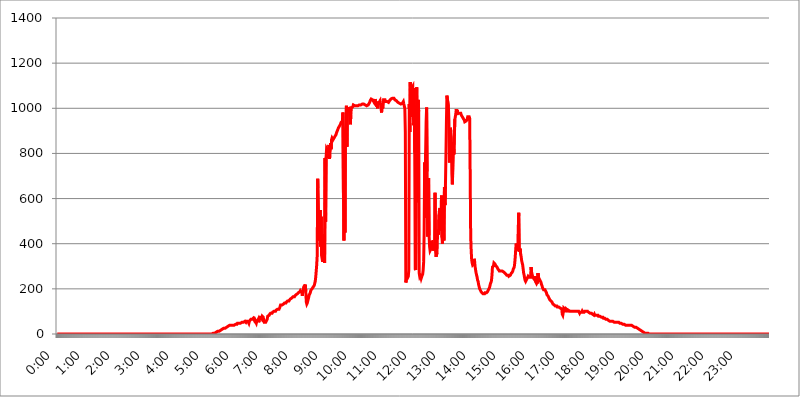
| Category | 2016.05.09. Intenzitás [W/m^2] |
|---|---|
| 0.0 | 0 |
| 0.0006944444444444445 | 0 |
| 0.001388888888888889 | 0 |
| 0.0020833333333333333 | 0 |
| 0.002777777777777778 | 0 |
| 0.003472222222222222 | 0 |
| 0.004166666666666667 | 0 |
| 0.004861111111111111 | 0 |
| 0.005555555555555556 | 0 |
| 0.0062499999999999995 | 0 |
| 0.006944444444444444 | 0 |
| 0.007638888888888889 | 0 |
| 0.008333333333333333 | 0 |
| 0.009027777777777779 | 0 |
| 0.009722222222222222 | 0 |
| 0.010416666666666666 | 0 |
| 0.011111111111111112 | 0 |
| 0.011805555555555555 | 0 |
| 0.012499999999999999 | 0 |
| 0.013194444444444444 | 0 |
| 0.013888888888888888 | 0 |
| 0.014583333333333332 | 0 |
| 0.015277777777777777 | 0 |
| 0.015972222222222224 | 0 |
| 0.016666666666666666 | 0 |
| 0.017361111111111112 | 0 |
| 0.018055555555555557 | 0 |
| 0.01875 | 0 |
| 0.019444444444444445 | 0 |
| 0.02013888888888889 | 0 |
| 0.020833333333333332 | 0 |
| 0.02152777777777778 | 0 |
| 0.022222222222222223 | 0 |
| 0.02291666666666667 | 0 |
| 0.02361111111111111 | 0 |
| 0.024305555555555556 | 0 |
| 0.024999999999999998 | 0 |
| 0.025694444444444447 | 0 |
| 0.02638888888888889 | 0 |
| 0.027083333333333334 | 0 |
| 0.027777777777777776 | 0 |
| 0.02847222222222222 | 0 |
| 0.029166666666666664 | 0 |
| 0.029861111111111113 | 0 |
| 0.030555555555555555 | 0 |
| 0.03125 | 0 |
| 0.03194444444444445 | 0 |
| 0.03263888888888889 | 0 |
| 0.03333333333333333 | 0 |
| 0.034027777777777775 | 0 |
| 0.034722222222222224 | 0 |
| 0.035416666666666666 | 0 |
| 0.036111111111111115 | 0 |
| 0.03680555555555556 | 0 |
| 0.0375 | 0 |
| 0.03819444444444444 | 0 |
| 0.03888888888888889 | 0 |
| 0.03958333333333333 | 0 |
| 0.04027777777777778 | 0 |
| 0.04097222222222222 | 0 |
| 0.041666666666666664 | 0 |
| 0.042361111111111106 | 0 |
| 0.04305555555555556 | 0 |
| 0.043750000000000004 | 0 |
| 0.044444444444444446 | 0 |
| 0.04513888888888889 | 0 |
| 0.04583333333333334 | 0 |
| 0.04652777777777778 | 0 |
| 0.04722222222222222 | 0 |
| 0.04791666666666666 | 0 |
| 0.04861111111111111 | 0 |
| 0.049305555555555554 | 0 |
| 0.049999999999999996 | 0 |
| 0.05069444444444445 | 0 |
| 0.051388888888888894 | 0 |
| 0.052083333333333336 | 0 |
| 0.05277777777777778 | 0 |
| 0.05347222222222222 | 0 |
| 0.05416666666666667 | 0 |
| 0.05486111111111111 | 0 |
| 0.05555555555555555 | 0 |
| 0.05625 | 0 |
| 0.05694444444444444 | 0 |
| 0.057638888888888885 | 0 |
| 0.05833333333333333 | 0 |
| 0.05902777777777778 | 0 |
| 0.059722222222222225 | 0 |
| 0.06041666666666667 | 0 |
| 0.061111111111111116 | 0 |
| 0.06180555555555556 | 0 |
| 0.0625 | 0 |
| 0.06319444444444444 | 0 |
| 0.06388888888888888 | 0 |
| 0.06458333333333334 | 0 |
| 0.06527777777777778 | 0 |
| 0.06597222222222222 | 0 |
| 0.06666666666666667 | 0 |
| 0.06736111111111111 | 0 |
| 0.06805555555555555 | 0 |
| 0.06874999999999999 | 0 |
| 0.06944444444444443 | 0 |
| 0.07013888888888889 | 0 |
| 0.07083333333333333 | 0 |
| 0.07152777777777779 | 0 |
| 0.07222222222222223 | 0 |
| 0.07291666666666667 | 0 |
| 0.07361111111111111 | 0 |
| 0.07430555555555556 | 0 |
| 0.075 | 0 |
| 0.07569444444444444 | 0 |
| 0.0763888888888889 | 0 |
| 0.07708333333333334 | 0 |
| 0.07777777777777778 | 0 |
| 0.07847222222222222 | 0 |
| 0.07916666666666666 | 0 |
| 0.0798611111111111 | 0 |
| 0.08055555555555556 | 0 |
| 0.08125 | 0 |
| 0.08194444444444444 | 0 |
| 0.08263888888888889 | 0 |
| 0.08333333333333333 | 0 |
| 0.08402777777777777 | 0 |
| 0.08472222222222221 | 0 |
| 0.08541666666666665 | 0 |
| 0.08611111111111112 | 0 |
| 0.08680555555555557 | 0 |
| 0.08750000000000001 | 0 |
| 0.08819444444444445 | 0 |
| 0.08888888888888889 | 0 |
| 0.08958333333333333 | 0 |
| 0.09027777777777778 | 0 |
| 0.09097222222222222 | 0 |
| 0.09166666666666667 | 0 |
| 0.09236111111111112 | 0 |
| 0.09305555555555556 | 0 |
| 0.09375 | 0 |
| 0.09444444444444444 | 0 |
| 0.09513888888888888 | 0 |
| 0.09583333333333333 | 0 |
| 0.09652777777777777 | 0 |
| 0.09722222222222222 | 0 |
| 0.09791666666666667 | 0 |
| 0.09861111111111111 | 0 |
| 0.09930555555555555 | 0 |
| 0.09999999999999999 | 0 |
| 0.10069444444444443 | 0 |
| 0.1013888888888889 | 0 |
| 0.10208333333333335 | 0 |
| 0.10277777777777779 | 0 |
| 0.10347222222222223 | 0 |
| 0.10416666666666667 | 0 |
| 0.10486111111111111 | 0 |
| 0.10555555555555556 | 0 |
| 0.10625 | 0 |
| 0.10694444444444444 | 0 |
| 0.1076388888888889 | 0 |
| 0.10833333333333334 | 0 |
| 0.10902777777777778 | 0 |
| 0.10972222222222222 | 0 |
| 0.1111111111111111 | 0 |
| 0.11180555555555556 | 0 |
| 0.11180555555555556 | 0 |
| 0.1125 | 0 |
| 0.11319444444444444 | 0 |
| 0.11388888888888889 | 0 |
| 0.11458333333333333 | 0 |
| 0.11527777777777777 | 0 |
| 0.11597222222222221 | 0 |
| 0.11666666666666665 | 0 |
| 0.1173611111111111 | 0 |
| 0.11805555555555557 | 0 |
| 0.11944444444444445 | 0 |
| 0.12013888888888889 | 0 |
| 0.12083333333333333 | 0 |
| 0.12152777777777778 | 0 |
| 0.12222222222222223 | 0 |
| 0.12291666666666667 | 0 |
| 0.12291666666666667 | 0 |
| 0.12361111111111112 | 0 |
| 0.12430555555555556 | 0 |
| 0.125 | 0 |
| 0.12569444444444444 | 0 |
| 0.12638888888888888 | 0 |
| 0.12708333333333333 | 0 |
| 0.16875 | 0 |
| 0.12847222222222224 | 0 |
| 0.12916666666666668 | 0 |
| 0.12986111111111112 | 0 |
| 0.13055555555555556 | 0 |
| 0.13125 | 0 |
| 0.13194444444444445 | 0 |
| 0.1326388888888889 | 0 |
| 0.13333333333333333 | 0 |
| 0.13402777777777777 | 0 |
| 0.13402777777777777 | 0 |
| 0.13472222222222222 | 0 |
| 0.13541666666666666 | 0 |
| 0.1361111111111111 | 0 |
| 0.13749999999999998 | 0 |
| 0.13819444444444443 | 0 |
| 0.1388888888888889 | 0 |
| 0.13958333333333334 | 0 |
| 0.14027777777777778 | 0 |
| 0.14097222222222222 | 0 |
| 0.14166666666666666 | 0 |
| 0.1423611111111111 | 0 |
| 0.14305555555555557 | 0 |
| 0.14375000000000002 | 0 |
| 0.14444444444444446 | 0 |
| 0.1451388888888889 | 0 |
| 0.1451388888888889 | 0 |
| 0.14652777777777778 | 0 |
| 0.14722222222222223 | 0 |
| 0.14791666666666667 | 0 |
| 0.1486111111111111 | 0 |
| 0.14930555555555555 | 0 |
| 0.15 | 0 |
| 0.15069444444444444 | 0 |
| 0.15138888888888888 | 0 |
| 0.15208333333333332 | 0 |
| 0.15277777777777776 | 0 |
| 0.15347222222222223 | 0 |
| 0.15416666666666667 | 0 |
| 0.15486111111111112 | 0 |
| 0.15555555555555556 | 0 |
| 0.15625 | 0 |
| 0.15694444444444444 | 0 |
| 0.15763888888888888 | 0 |
| 0.15833333333333333 | 0 |
| 0.15902777777777777 | 0 |
| 0.15972222222222224 | 0 |
| 0.16041666666666668 | 0 |
| 0.16111111111111112 | 0 |
| 0.16180555555555556 | 0 |
| 0.1625 | 0 |
| 0.16319444444444445 | 0 |
| 0.1638888888888889 | 0 |
| 0.16458333333333333 | 0 |
| 0.16527777777777777 | 0 |
| 0.16597222222222222 | 0 |
| 0.16666666666666666 | 0 |
| 0.1673611111111111 | 0 |
| 0.16805555555555554 | 0 |
| 0.16874999999999998 | 0 |
| 0.16944444444444443 | 0 |
| 0.17013888888888887 | 0 |
| 0.1708333333333333 | 0 |
| 0.17152777777777775 | 0 |
| 0.17222222222222225 | 0 |
| 0.1729166666666667 | 0 |
| 0.17361111111111113 | 0 |
| 0.17430555555555557 | 0 |
| 0.17500000000000002 | 0 |
| 0.17569444444444446 | 0 |
| 0.1763888888888889 | 0 |
| 0.17708333333333334 | 0 |
| 0.17777777777777778 | 0 |
| 0.17847222222222223 | 0 |
| 0.17916666666666667 | 0 |
| 0.1798611111111111 | 0 |
| 0.18055555555555555 | 0 |
| 0.18125 | 0 |
| 0.18194444444444444 | 0 |
| 0.1826388888888889 | 0 |
| 0.18333333333333335 | 0 |
| 0.1840277777777778 | 0 |
| 0.18472222222222223 | 0 |
| 0.18541666666666667 | 0 |
| 0.18611111111111112 | 0 |
| 0.18680555555555556 | 0 |
| 0.1875 | 0 |
| 0.18819444444444444 | 0 |
| 0.18888888888888888 | 0 |
| 0.18958333333333333 | 0 |
| 0.19027777777777777 | 0 |
| 0.1909722222222222 | 0 |
| 0.19166666666666665 | 0 |
| 0.19236111111111112 | 0 |
| 0.19305555555555554 | 0 |
| 0.19375 | 0 |
| 0.19444444444444445 | 0 |
| 0.1951388888888889 | 0 |
| 0.19583333333333333 | 0 |
| 0.19652777777777777 | 0 |
| 0.19722222222222222 | 0 |
| 0.19791666666666666 | 0 |
| 0.1986111111111111 | 0 |
| 0.19930555555555554 | 0 |
| 0.19999999999999998 | 0 |
| 0.20069444444444443 | 0 |
| 0.20138888888888887 | 0 |
| 0.2020833333333333 | 0 |
| 0.2027777777777778 | 0 |
| 0.2034722222222222 | 0 |
| 0.2041666666666667 | 0 |
| 0.20486111111111113 | 0 |
| 0.20555555555555557 | 0 |
| 0.20625000000000002 | 0 |
| 0.20694444444444446 | 0 |
| 0.2076388888888889 | 0 |
| 0.20833333333333334 | 0 |
| 0.20902777777777778 | 0 |
| 0.20972222222222223 | 0 |
| 0.21041666666666667 | 0 |
| 0.2111111111111111 | 0 |
| 0.21180555555555555 | 0 |
| 0.2125 | 0 |
| 0.21319444444444444 | 0 |
| 0.2138888888888889 | 0 |
| 0.21458333333333335 | 0 |
| 0.2152777777777778 | 0 |
| 0.21597222222222223 | 0 |
| 0.21666666666666667 | 0 |
| 0.21736111111111112 | 3.525 |
| 0.21805555555555556 | 3.525 |
| 0.21875 | 3.525 |
| 0.21944444444444444 | 3.525 |
| 0.22013888888888888 | 3.525 |
| 0.22083333333333333 | 3.525 |
| 0.22152777777777777 | 7.887 |
| 0.2222222222222222 | 7.887 |
| 0.22291666666666665 | 7.887 |
| 0.2236111111111111 | 7.887 |
| 0.22430555555555556 | 7.887 |
| 0.225 | 12.257 |
| 0.22569444444444445 | 12.257 |
| 0.2263888888888889 | 12.257 |
| 0.22708333333333333 | 12.257 |
| 0.22777777777777777 | 16.636 |
| 0.22847222222222222 | 16.636 |
| 0.22916666666666666 | 16.636 |
| 0.2298611111111111 | 21.024 |
| 0.23055555555555554 | 21.024 |
| 0.23124999999999998 | 21.024 |
| 0.23194444444444443 | 21.024 |
| 0.23263888888888887 | 21.024 |
| 0.2333333333333333 | 25.419 |
| 0.2340277777777778 | 25.419 |
| 0.2347222222222222 | 25.419 |
| 0.2354166666666667 | 25.419 |
| 0.23611111111111113 | 29.823 |
| 0.23680555555555557 | 29.823 |
| 0.23750000000000002 | 29.823 |
| 0.23819444444444446 | 29.823 |
| 0.2388888888888889 | 34.234 |
| 0.23958333333333334 | 34.234 |
| 0.24027777777777778 | 34.234 |
| 0.24097222222222223 | 34.234 |
| 0.24166666666666667 | 38.653 |
| 0.2423611111111111 | 38.653 |
| 0.24305555555555555 | 38.653 |
| 0.24375 | 38.653 |
| 0.24444444444444446 | 38.653 |
| 0.24513888888888888 | 38.653 |
| 0.24583333333333335 | 38.653 |
| 0.2465277777777778 | 38.653 |
| 0.24722222222222223 | 38.653 |
| 0.24791666666666667 | 38.653 |
| 0.24861111111111112 | 38.653 |
| 0.24930555555555556 | 43.079 |
| 0.25 | 43.079 |
| 0.25069444444444444 | 43.079 |
| 0.2513888888888889 | 43.079 |
| 0.2520833333333333 | 43.079 |
| 0.25277777777777777 | 47.511 |
| 0.2534722222222222 | 47.511 |
| 0.25416666666666665 | 47.511 |
| 0.2548611111111111 | 47.511 |
| 0.2555555555555556 | 47.511 |
| 0.25625000000000003 | 47.511 |
| 0.2569444444444445 | 47.511 |
| 0.2576388888888889 | 47.511 |
| 0.25833333333333336 | 47.511 |
| 0.2590277777777778 | 51.951 |
| 0.25972222222222224 | 51.951 |
| 0.2604166666666667 | 51.951 |
| 0.2611111111111111 | 51.951 |
| 0.26180555555555557 | 51.951 |
| 0.2625 | 51.951 |
| 0.26319444444444445 | 56.398 |
| 0.2638888888888889 | 56.398 |
| 0.26458333333333334 | 51.951 |
| 0.2652777777777778 | 56.398 |
| 0.2659722222222222 | 56.398 |
| 0.26666666666666666 | 56.398 |
| 0.2673611111111111 | 56.398 |
| 0.26805555555555555 | 51.951 |
| 0.26875 | 47.511 |
| 0.26944444444444443 | 56.398 |
| 0.2701388888888889 | 56.398 |
| 0.2708333333333333 | 56.398 |
| 0.27152777777777776 | 65.31 |
| 0.2722222222222222 | 65.31 |
| 0.27291666666666664 | 65.31 |
| 0.2736111111111111 | 65.31 |
| 0.2743055555555555 | 65.31 |
| 0.27499999999999997 | 69.775 |
| 0.27569444444444446 | 65.31 |
| 0.27638888888888885 | 60.85 |
| 0.27708333333333335 | 65.31 |
| 0.2777777777777778 | 60.85 |
| 0.27847222222222223 | 51.951 |
| 0.2791666666666667 | 47.511 |
| 0.2798611111111111 | 56.398 |
| 0.28055555555555556 | 56.398 |
| 0.28125 | 60.85 |
| 0.28194444444444444 | 65.31 |
| 0.2826388888888889 | 51.951 |
| 0.2833333333333333 | 60.85 |
| 0.28402777777777777 | 74.246 |
| 0.2847222222222222 | 74.246 |
| 0.28541666666666665 | 74.246 |
| 0.28611111111111115 | 74.246 |
| 0.28680555555555554 | 69.775 |
| 0.28750000000000003 | 78.722 |
| 0.2881944444444445 | 78.722 |
| 0.2888888888888889 | 74.246 |
| 0.28958333333333336 | 60.85 |
| 0.2902777777777778 | 51.951 |
| 0.29097222222222224 | 51.951 |
| 0.2916666666666667 | 51.951 |
| 0.2923611111111111 | 51.951 |
| 0.29305555555555557 | 56.398 |
| 0.29375 | 56.398 |
| 0.29444444444444445 | 65.31 |
| 0.2951388888888889 | 78.722 |
| 0.29583333333333334 | 78.722 |
| 0.2965277777777778 | 78.722 |
| 0.2972222222222222 | 83.205 |
| 0.29791666666666666 | 87.692 |
| 0.2986111111111111 | 87.692 |
| 0.29930555555555555 | 92.184 |
| 0.3 | 92.184 |
| 0.30069444444444443 | 92.184 |
| 0.3013888888888889 | 92.184 |
| 0.3020833333333333 | 96.682 |
| 0.30277777777777776 | 96.682 |
| 0.3034722222222222 | 96.682 |
| 0.30416666666666664 | 101.184 |
| 0.3048611111111111 | 101.184 |
| 0.3055555555555555 | 101.184 |
| 0.30624999999999997 | 101.184 |
| 0.3069444444444444 | 105.69 |
| 0.3076388888888889 | 105.69 |
| 0.30833333333333335 | 105.69 |
| 0.3090277777777778 | 110.201 |
| 0.30972222222222223 | 110.201 |
| 0.3104166666666667 | 110.201 |
| 0.3111111111111111 | 110.201 |
| 0.31180555555555556 | 114.716 |
| 0.3125 | 114.716 |
| 0.31319444444444444 | 128.284 |
| 0.3138888888888889 | 128.284 |
| 0.3145833333333333 | 128.284 |
| 0.31527777777777777 | 128.284 |
| 0.3159722222222222 | 128.284 |
| 0.31666666666666665 | 128.284 |
| 0.31736111111111115 | 132.814 |
| 0.31805555555555554 | 132.814 |
| 0.31875000000000003 | 137.347 |
| 0.3194444444444445 | 137.347 |
| 0.3201388888888889 | 137.347 |
| 0.32083333333333336 | 137.347 |
| 0.3215277777777778 | 141.884 |
| 0.32222222222222224 | 141.884 |
| 0.3229166666666667 | 146.423 |
| 0.3236111111111111 | 146.423 |
| 0.32430555555555557 | 146.423 |
| 0.325 | 146.423 |
| 0.32569444444444445 | 150.964 |
| 0.3263888888888889 | 150.964 |
| 0.32708333333333334 | 155.509 |
| 0.3277777777777778 | 155.509 |
| 0.3284722222222222 | 155.509 |
| 0.32916666666666666 | 160.056 |
| 0.3298611111111111 | 160.056 |
| 0.33055555555555555 | 164.605 |
| 0.33125 | 164.605 |
| 0.33194444444444443 | 164.605 |
| 0.3326388888888889 | 164.605 |
| 0.3333333333333333 | 169.156 |
| 0.3340277777777778 | 169.156 |
| 0.3347222222222222 | 173.709 |
| 0.3354166666666667 | 173.709 |
| 0.3361111111111111 | 173.709 |
| 0.3368055555555556 | 178.264 |
| 0.33749999999999997 | 178.264 |
| 0.33819444444444446 | 182.82 |
| 0.33888888888888885 | 182.82 |
| 0.33958333333333335 | 182.82 |
| 0.34027777777777773 | 187.378 |
| 0.34097222222222223 | 191.937 |
| 0.3416666666666666 | 191.937 |
| 0.3423611111111111 | 191.937 |
| 0.3430555555555555 | 182.82 |
| 0.34375 | 169.156 |
| 0.3444444444444445 | 187.378 |
| 0.3451388888888889 | 201.058 |
| 0.3458333333333334 | 210.182 |
| 0.34652777777777777 | 210.182 |
| 0.34722222222222227 | 214.746 |
| 0.34791666666666665 | 219.309 |
| 0.34861111111111115 | 187.378 |
| 0.34930555555555554 | 141.884 |
| 0.35000000000000003 | 132.814 |
| 0.3506944444444444 | 137.347 |
| 0.3513888888888889 | 146.423 |
| 0.3520833333333333 | 155.509 |
| 0.3527777777777778 | 164.605 |
| 0.3534722222222222 | 173.709 |
| 0.3541666666666667 | 178.264 |
| 0.3548611111111111 | 182.82 |
| 0.35555555555555557 | 191.937 |
| 0.35625 | 196.497 |
| 0.35694444444444445 | 196.497 |
| 0.3576388888888889 | 201.058 |
| 0.35833333333333334 | 205.62 |
| 0.3590277777777778 | 205.62 |
| 0.3597222222222222 | 205.62 |
| 0.36041666666666666 | 214.746 |
| 0.3611111111111111 | 223.873 |
| 0.36180555555555555 | 233 |
| 0.3625 | 251.251 |
| 0.36319444444444443 | 278.603 |
| 0.3638888888888889 | 305.898 |
| 0.3645833333333333 | 346.682 |
| 0.3652777777777778 | 687.544 |
| 0.3659722222222222 | 691.608 |
| 0.3666666666666667 | 458.38 |
| 0.3673611111111111 | 414.035 |
| 0.3680555555555556 | 440.702 |
| 0.36874999999999997 | 549.704 |
| 0.36944444444444446 | 387.202 |
| 0.37013888888888885 | 519.555 |
| 0.37083333333333335 | 346.682 |
| 0.37152777777777773 | 333.113 |
| 0.37222222222222223 | 319.517 |
| 0.3729166666666666 | 373.729 |
| 0.3736111111111111 | 360.221 |
| 0.3743055555555555 | 440.702 |
| 0.375 | 314.98 |
| 0.3756944444444445 | 779.42 |
| 0.3763888888888889 | 497.836 |
| 0.3770833333333334 | 783.342 |
| 0.37777777777777777 | 822.26 |
| 0.37847222222222227 | 822.26 |
| 0.37916666666666665 | 814.519 |
| 0.37986111111111115 | 822.26 |
| 0.38055555555555554 | 779.42 |
| 0.38125000000000003 | 837.682 |
| 0.3819444444444444 | 775.492 |
| 0.3826388888888889 | 829.981 |
| 0.3833333333333333 | 845.365 |
| 0.3840277777777778 | 818.392 |
| 0.3847222222222222 | 860.676 |
| 0.3854166666666667 | 868.305 |
| 0.3861111111111111 | 864.493 |
| 0.38680555555555557 | 860.676 |
| 0.3875 | 864.493 |
| 0.38819444444444445 | 868.305 |
| 0.3888888888888889 | 872.114 |
| 0.38958333333333334 | 875.918 |
| 0.3902777777777778 | 879.719 |
| 0.3909722222222222 | 883.516 |
| 0.39166666666666666 | 891.099 |
| 0.3923611111111111 | 894.885 |
| 0.39305555555555555 | 902.447 |
| 0.39375 | 902.447 |
| 0.39444444444444443 | 913.766 |
| 0.3951388888888889 | 917.534 |
| 0.3958333333333333 | 921.298 |
| 0.3965277777777778 | 925.06 |
| 0.3972222222222222 | 928.819 |
| 0.3979166666666667 | 936.33 |
| 0.3986111111111111 | 940.082 |
| 0.3993055555555556 | 940.082 |
| 0.39999999999999997 | 943.832 |
| 0.40069444444444446 | 981.244 |
| 0.40138888888888885 | 625.784 |
| 0.40208333333333335 | 414.035 |
| 0.40277777777777773 | 883.516 |
| 0.40347222222222223 | 449.551 |
| 0.4041666666666666 | 891.099 |
| 0.4048611111111111 | 943.832 |
| 0.4055555555555555 | 1011.118 |
| 0.40625 | 829.981 |
| 0.4069444444444445 | 1003.65 |
| 0.4076388888888889 | 996.182 |
| 0.4083333333333334 | 996.182 |
| 0.40902777777777777 | 996.182 |
| 0.40972222222222227 | 999.916 |
| 0.41041666666666665 | 1003.65 |
| 0.41111111111111115 | 928.819 |
| 0.41180555555555554 | 973.772 |
| 0.41250000000000003 | 999.916 |
| 0.4131944444444444 | 999.916 |
| 0.4138888888888889 | 1003.65 |
| 0.4145833333333333 | 1007.383 |
| 0.4152777777777778 | 1014.852 |
| 0.4159722222222222 | 1014.852 |
| 0.4166666666666667 | 1011.118 |
| 0.4173611111111111 | 1011.118 |
| 0.41805555555555557 | 1011.118 |
| 0.41875 | 1007.383 |
| 0.41944444444444445 | 1011.118 |
| 0.4201388888888889 | 1007.383 |
| 0.42083333333333334 | 1014.852 |
| 0.4215277777777778 | 1011.118 |
| 0.4222222222222222 | 1011.118 |
| 0.42291666666666666 | 1011.118 |
| 0.4236111111111111 | 1014.852 |
| 0.42430555555555555 | 1014.852 |
| 0.425 | 1014.852 |
| 0.42569444444444443 | 1014.852 |
| 0.4263888888888889 | 1011.118 |
| 0.4270833333333333 | 1014.852 |
| 0.4277777777777778 | 1018.587 |
| 0.4284722222222222 | 1018.587 |
| 0.4291666666666667 | 1018.587 |
| 0.4298611111111111 | 1018.587 |
| 0.4305555555555556 | 1014.852 |
| 0.43124999999999997 | 1014.852 |
| 0.43194444444444446 | 1014.852 |
| 0.43263888888888885 | 1011.118 |
| 0.43333333333333335 | 1011.118 |
| 0.43402777777777773 | 1011.118 |
| 0.43472222222222223 | 1014.852 |
| 0.4354166666666666 | 1014.852 |
| 0.4361111111111111 | 1014.852 |
| 0.4368055555555555 | 1014.852 |
| 0.4375 | 1018.587 |
| 0.4381944444444445 | 1026.06 |
| 0.4388888888888889 | 1033.537 |
| 0.4395833333333334 | 1037.277 |
| 0.44027777777777777 | 1041.019 |
| 0.44097222222222227 | 1044.762 |
| 0.44166666666666665 | 1037.277 |
| 0.44236111111111115 | 1037.277 |
| 0.44305555555555554 | 1041.019 |
| 0.44375000000000003 | 1037.277 |
| 0.4444444444444444 | 1026.06 |
| 0.4451388888888889 | 1026.06 |
| 0.4458333333333333 | 1041.019 |
| 0.4465277777777778 | 1026.06 |
| 0.4472222222222222 | 1018.587 |
| 0.4479166666666667 | 1007.383 |
| 0.4486111111111111 | 1014.852 |
| 0.44930555555555557 | 999.916 |
| 0.45 | 1029.798 |
| 0.45069444444444445 | 1018.587 |
| 0.4513888888888889 | 1026.06 |
| 0.45208333333333334 | 1029.798 |
| 0.4527777777777778 | 1033.537 |
| 0.4534722222222222 | 1033.537 |
| 0.45416666666666666 | 1029.798 |
| 0.4548611111111111 | 981.244 |
| 0.45555555555555555 | 1011.118 |
| 0.45625 | 999.916 |
| 0.45694444444444443 | 1007.383 |
| 0.4576388888888889 | 1037.277 |
| 0.4583333333333333 | 1037.277 |
| 0.4590277777777778 | 1033.537 |
| 0.4597222222222222 | 1037.277 |
| 0.4604166666666667 | 1029.798 |
| 0.4611111111111111 | 1029.798 |
| 0.4618055555555556 | 1029.798 |
| 0.46249999999999997 | 1029.798 |
| 0.46319444444444446 | 1026.06 |
| 0.46388888888888885 | 1026.06 |
| 0.46458333333333335 | 1026.06 |
| 0.46527777777777773 | 1026.06 |
| 0.46597222222222223 | 1033.537 |
| 0.4666666666666666 | 1037.277 |
| 0.4673611111111111 | 1037.277 |
| 0.4680555555555555 | 1041.019 |
| 0.46875 | 1041.019 |
| 0.4694444444444445 | 1044.762 |
| 0.4701388888888889 | 1044.762 |
| 0.4708333333333334 | 1044.762 |
| 0.47152777777777777 | 1044.762 |
| 0.47222222222222227 | 1044.762 |
| 0.47291666666666665 | 1041.019 |
| 0.47361111111111115 | 1037.277 |
| 0.47430555555555554 | 1037.277 |
| 0.47500000000000003 | 1037.277 |
| 0.4756944444444444 | 1033.537 |
| 0.4763888888888889 | 1033.537 |
| 0.4770833333333333 | 1029.798 |
| 0.4777777777777778 | 1026.06 |
| 0.4784722222222222 | 1026.06 |
| 0.4791666666666667 | 1022.323 |
| 0.4798611111111111 | 1022.323 |
| 0.48055555555555557 | 1018.587 |
| 0.48125 | 1018.587 |
| 0.48194444444444445 | 1018.587 |
| 0.4826388888888889 | 1018.587 |
| 0.48333333333333334 | 1022.323 |
| 0.4840277777777778 | 1022.323 |
| 0.4847222222222222 | 1026.06 |
| 0.48541666666666666 | 1029.798 |
| 0.4861111111111111 | 1018.587 |
| 0.48680555555555555 | 1022.323 |
| 0.4875 | 999.916 |
| 0.48819444444444443 | 894.885 |
| 0.4888888888888889 | 228.436 |
| 0.4895833333333333 | 237.564 |
| 0.4902777777777778 | 264.932 |
| 0.4909722222222222 | 255.813 |
| 0.4916666666666667 | 251.251 |
| 0.4923611111111111 | 255.813 |
| 0.4930555555555556 | 283.156 |
| 0.49374999999999997 | 1018.587 |
| 0.49444444444444446 | 894.885 |
| 0.49513888888888885 | 1116.426 |
| 0.49583333333333335 | 962.555 |
| 0.49652777777777773 | 1063.51 |
| 0.49722222222222223 | 1089.873 |
| 0.4979166666666666 | 1093.653 |
| 0.4986111111111111 | 1097.437 |
| 0.4993055555555555 | 1101.226 |
| 0.5 | 925.06 |
| 0.5006944444444444 | 1089.873 |
| 0.5013888888888889 | 802.868 |
| 0.5020833333333333 | 287.709 |
| 0.5027777777777778 | 283.156 |
| 0.5034722222222222 | 902.447 |
| 0.5041666666666667 | 1093.653 |
| 0.5048611111111111 | 1089.873 |
| 0.5055555555555555 | 583.779 |
| 0.50625 | 1037.277 |
| 0.5069444444444444 | 984.98 |
| 0.5076388888888889 | 269.49 |
| 0.5083333333333333 | 255.813 |
| 0.5090277777777777 | 260.373 |
| 0.5097222222222222 | 255.813 |
| 0.5104166666666666 | 246.689 |
| 0.5111111111111112 | 246.689 |
| 0.5118055555555555 | 260.373 |
| 0.5125000000000001 | 264.932 |
| 0.5131944444444444 | 283.156 |
| 0.513888888888889 | 319.517 |
| 0.5145833333333333 | 449.551 |
| 0.5152777777777778 | 759.723 |
| 0.5159722222222222 | 515.223 |
| 0.5166666666666667 | 802.868 |
| 0.517361111111111 | 940.082 |
| 0.5180555555555556 | 1003.65 |
| 0.5187499999999999 | 719.877 |
| 0.5194444444444445 | 431.833 |
| 0.5201388888888888 | 480.356 |
| 0.5208333333333334 | 691.608 |
| 0.5215277777777778 | 436.27 |
| 0.5222222222222223 | 387.202 |
| 0.5229166666666667 | 369.23 |
| 0.5236111111111111 | 369.23 |
| 0.5243055555555556 | 378.224 |
| 0.525 | 414.035 |
| 0.5256944444444445 | 409.574 |
| 0.5263888888888889 | 387.202 |
| 0.5270833333333333 | 369.23 |
| 0.5277777777777778 | 369.23 |
| 0.5284722222222222 | 369.23 |
| 0.5291666666666667 | 396.164 |
| 0.5298611111111111 | 625.784 |
| 0.5305555555555556 | 369.23 |
| 0.53125 | 342.162 |
| 0.5319444444444444 | 342.162 |
| 0.5326388888888889 | 360.221 |
| 0.5333333333333333 | 440.702 |
| 0.5340277777777778 | 458.38 |
| 0.5347222222222222 | 440.702 |
| 0.5354166666666667 | 528.2 |
| 0.5361111111111111 | 549.704 |
| 0.5368055555555555 | 558.261 |
| 0.5375 | 458.38 |
| 0.5381944444444444 | 506.542 |
| 0.5388888888888889 | 613.252 |
| 0.5395833333333333 | 427.39 |
| 0.5402777777777777 | 400.638 |
| 0.5409722222222222 | 609.062 |
| 0.5416666666666666 | 497.836 |
| 0.5423611111111112 | 414.035 |
| 0.5430555555555555 | 650.667 |
| 0.5437500000000001 | 571.049 |
| 0.5444444444444444 | 654.791 |
| 0.545138888888889 | 791.169 |
| 0.5458333333333333 | 940.082 |
| 0.5465277777777778 | 1056.004 |
| 0.5472222222222222 | 1059.756 |
| 0.5479166666666667 | 1052.255 |
| 0.548611111111111 | 1007.383 |
| 0.5493055555555556 | 947.58 |
| 0.5499999999999999 | 759.723 |
| 0.5506944444444445 | 818.392 |
| 0.5513888888888888 | 913.766 |
| 0.5520833333333334 | 894.885 |
| 0.5527777777777778 | 864.493 |
| 0.5534722222222223 | 707.8 |
| 0.5541666666666667 | 663.019 |
| 0.5548611111111111 | 663.019 |
| 0.5555555555555556 | 849.199 |
| 0.55625 | 795.074 |
| 0.5569444444444445 | 795.074 |
| 0.5576388888888889 | 951.327 |
| 0.5583333333333333 | 962.555 |
| 0.5590277777777778 | 977.508 |
| 0.5597222222222222 | 996.182 |
| 0.5604166666666667 | 970.034 |
| 0.5611111111111111 | 992.448 |
| 0.5618055555555556 | 977.508 |
| 0.5625 | 973.772 |
| 0.5631944444444444 | 977.508 |
| 0.5638888888888889 | 977.508 |
| 0.5645833333333333 | 977.508 |
| 0.5652777777777778 | 977.508 |
| 0.5659722222222222 | 977.508 |
| 0.5666666666666667 | 970.034 |
| 0.5673611111111111 | 966.295 |
| 0.5680555555555555 | 962.555 |
| 0.56875 | 962.555 |
| 0.5694444444444444 | 955.071 |
| 0.5701388888888889 | 955.071 |
| 0.5708333333333333 | 947.58 |
| 0.5715277777777777 | 940.082 |
| 0.5722222222222222 | 936.33 |
| 0.5729166666666666 | 943.832 |
| 0.5736111111111112 | 943.832 |
| 0.5743055555555555 | 943.832 |
| 0.5750000000000001 | 951.327 |
| 0.5756944444444444 | 962.555 |
| 0.576388888888889 | 966.295 |
| 0.5770833333333333 | 962.555 |
| 0.5777777777777778 | 962.555 |
| 0.5784722222222222 | 955.071 |
| 0.5791666666666667 | 951.327 |
| 0.579861111111111 | 436.27 |
| 0.5805555555555556 | 369.23 |
| 0.5812499999999999 | 328.584 |
| 0.5819444444444445 | 314.98 |
| 0.5826388888888888 | 305.898 |
| 0.5833333333333334 | 305.898 |
| 0.5840277777777778 | 310.44 |
| 0.5847222222222223 | 333.113 |
| 0.5854166666666667 | 319.517 |
| 0.5861111111111111 | 296.808 |
| 0.5868055555555556 | 283.156 |
| 0.5875 | 269.49 |
| 0.5881944444444445 | 260.373 |
| 0.5888888888888889 | 251.251 |
| 0.5895833333333333 | 237.564 |
| 0.5902777777777778 | 233 |
| 0.5909722222222222 | 219.309 |
| 0.5916666666666667 | 210.182 |
| 0.5923611111111111 | 201.058 |
| 0.5930555555555556 | 196.497 |
| 0.59375 | 191.937 |
| 0.5944444444444444 | 187.378 |
| 0.5951388888888889 | 187.378 |
| 0.5958333333333333 | 182.82 |
| 0.5965277777777778 | 182.82 |
| 0.5972222222222222 | 178.264 |
| 0.5979166666666667 | 178.264 |
| 0.5986111111111111 | 178.264 |
| 0.5993055555555555 | 178.264 |
| 0.6 | 182.82 |
| 0.6006944444444444 | 182.82 |
| 0.6013888888888889 | 182.82 |
| 0.6020833333333333 | 182.82 |
| 0.6027777777777777 | 182.82 |
| 0.6034722222222222 | 187.378 |
| 0.6041666666666666 | 191.937 |
| 0.6048611111111112 | 196.497 |
| 0.6055555555555555 | 201.058 |
| 0.6062500000000001 | 205.62 |
| 0.6069444444444444 | 214.746 |
| 0.607638888888889 | 223.873 |
| 0.6083333333333333 | 228.436 |
| 0.6090277777777778 | 237.564 |
| 0.6097222222222222 | 260.373 |
| 0.6104166666666667 | 296.808 |
| 0.611111111111111 | 296.808 |
| 0.6118055555555556 | 301.354 |
| 0.6124999999999999 | 314.98 |
| 0.6131944444444445 | 314.98 |
| 0.6138888888888888 | 310.44 |
| 0.6145833333333334 | 305.898 |
| 0.6152777777777778 | 301.354 |
| 0.6159722222222223 | 301.354 |
| 0.6166666666666667 | 296.808 |
| 0.6173611111111111 | 292.259 |
| 0.6180555555555556 | 287.709 |
| 0.61875 | 287.709 |
| 0.6194444444444445 | 283.156 |
| 0.6201388888888889 | 278.603 |
| 0.6208333333333333 | 278.603 |
| 0.6215277777777778 | 278.603 |
| 0.6222222222222222 | 278.603 |
| 0.6229166666666667 | 278.603 |
| 0.6236111111111111 | 278.603 |
| 0.6243055555555556 | 278.603 |
| 0.625 | 278.603 |
| 0.6256944444444444 | 278.603 |
| 0.6263888888888889 | 274.047 |
| 0.6270833333333333 | 274.047 |
| 0.6277777777777778 | 269.49 |
| 0.6284722222222222 | 269.49 |
| 0.6291666666666667 | 264.932 |
| 0.6298611111111111 | 264.932 |
| 0.6305555555555555 | 260.373 |
| 0.63125 | 260.373 |
| 0.6319444444444444 | 260.373 |
| 0.6326388888888889 | 260.373 |
| 0.6333333333333333 | 255.813 |
| 0.6340277777777777 | 255.813 |
| 0.6347222222222222 | 255.813 |
| 0.6354166666666666 | 260.373 |
| 0.6361111111111112 | 264.932 |
| 0.6368055555555555 | 269.49 |
| 0.6375000000000001 | 269.49 |
| 0.6381944444444444 | 274.047 |
| 0.638888888888889 | 278.603 |
| 0.6395833333333333 | 287.709 |
| 0.6402777777777778 | 287.709 |
| 0.6409722222222222 | 296.808 |
| 0.6416666666666667 | 314.98 |
| 0.642361111111111 | 342.162 |
| 0.6430555555555556 | 378.224 |
| 0.6437499999999999 | 400.638 |
| 0.6444444444444445 | 382.715 |
| 0.6451388888888888 | 369.23 |
| 0.6458333333333334 | 378.224 |
| 0.6465277777777778 | 458.38 |
| 0.6472222222222223 | 536.82 |
| 0.6479166666666667 | 364.728 |
| 0.6486111111111111 | 364.728 |
| 0.6493055555555556 | 378.224 |
| 0.65 | 351.198 |
| 0.6506944444444445 | 342.162 |
| 0.6513888888888889 | 324.052 |
| 0.6520833333333333 | 314.98 |
| 0.6527777777777778 | 305.898 |
| 0.6534722222222222 | 287.709 |
| 0.6541666666666667 | 269.49 |
| 0.6548611111111111 | 260.373 |
| 0.6555555555555556 | 246.689 |
| 0.65625 | 237.564 |
| 0.6569444444444444 | 233 |
| 0.6576388888888889 | 237.564 |
| 0.6583333333333333 | 237.564 |
| 0.6590277777777778 | 246.689 |
| 0.6597222222222222 | 251.251 |
| 0.6604166666666667 | 255.813 |
| 0.6611111111111111 | 255.813 |
| 0.6618055555555555 | 251.251 |
| 0.6625 | 251.251 |
| 0.6631944444444444 | 251.251 |
| 0.6638888888888889 | 251.251 |
| 0.6645833333333333 | 296.808 |
| 0.6652777777777777 | 274.047 |
| 0.6659722222222222 | 264.932 |
| 0.6666666666666666 | 255.813 |
| 0.6673611111111111 | 251.251 |
| 0.6680555555555556 | 246.689 |
| 0.6687500000000001 | 246.689 |
| 0.6694444444444444 | 246.689 |
| 0.6701388888888888 | 237.564 |
| 0.6708333333333334 | 255.813 |
| 0.6715277777777778 | 228.436 |
| 0.6722222222222222 | 223.873 |
| 0.6729166666666666 | 228.436 |
| 0.6736111111111112 | 223.873 |
| 0.6743055555555556 | 269.49 |
| 0.6749999999999999 | 233 |
| 0.6756944444444444 | 233 |
| 0.6763888888888889 | 242.127 |
| 0.6770833333333334 | 237.564 |
| 0.6777777777777777 | 233 |
| 0.6784722222222223 | 228.436 |
| 0.6791666666666667 | 219.309 |
| 0.6798611111111111 | 214.746 |
| 0.6805555555555555 | 205.62 |
| 0.68125 | 201.058 |
| 0.6819444444444445 | 196.497 |
| 0.6826388888888889 | 196.497 |
| 0.6833333333333332 | 196.497 |
| 0.6840277777777778 | 196.497 |
| 0.6847222222222222 | 191.937 |
| 0.6854166666666667 | 187.378 |
| 0.686111111111111 | 182.82 |
| 0.6868055555555556 | 173.709 |
| 0.6875 | 173.709 |
| 0.6881944444444444 | 169.156 |
| 0.688888888888889 | 164.605 |
| 0.6895833333333333 | 160.056 |
| 0.6902777777777778 | 155.509 |
| 0.6909722222222222 | 150.964 |
| 0.6916666666666668 | 150.964 |
| 0.6923611111111111 | 146.423 |
| 0.6930555555555555 | 146.423 |
| 0.69375 | 141.884 |
| 0.6944444444444445 | 137.347 |
| 0.6951388888888889 | 132.814 |
| 0.6958333333333333 | 132.814 |
| 0.6965277777777777 | 132.814 |
| 0.6972222222222223 | 128.284 |
| 0.6979166666666666 | 128.284 |
| 0.6986111111111111 | 123.758 |
| 0.6993055555555556 | 123.758 |
| 0.7000000000000001 | 123.758 |
| 0.7006944444444444 | 123.758 |
| 0.7013888888888888 | 119.235 |
| 0.7020833333333334 | 119.235 |
| 0.7027777777777778 | 119.235 |
| 0.7034722222222222 | 119.235 |
| 0.7041666666666666 | 119.235 |
| 0.7048611111111112 | 119.235 |
| 0.7055555555555556 | 114.716 |
| 0.7062499999999999 | 114.716 |
| 0.7069444444444444 | 114.716 |
| 0.7076388888888889 | 110.201 |
| 0.7083333333333334 | 87.692 |
| 0.7090277777777777 | 83.205 |
| 0.7097222222222223 | 96.682 |
| 0.7104166666666667 | 114.716 |
| 0.7111111111111111 | 114.716 |
| 0.7118055555555555 | 110.201 |
| 0.7125 | 110.201 |
| 0.7131944444444445 | 96.682 |
| 0.7138888888888889 | 110.201 |
| 0.7145833333333332 | 110.201 |
| 0.7152777777777778 | 105.69 |
| 0.7159722222222222 | 96.682 |
| 0.7166666666666667 | 105.69 |
| 0.717361111111111 | 105.69 |
| 0.7180555555555556 | 105.69 |
| 0.71875 | 101.184 |
| 0.7194444444444444 | 101.184 |
| 0.720138888888889 | 101.184 |
| 0.7208333333333333 | 101.184 |
| 0.7215277777777778 | 101.184 |
| 0.7222222222222222 | 101.184 |
| 0.7229166666666668 | 101.184 |
| 0.7236111111111111 | 101.184 |
| 0.7243055555555555 | 101.184 |
| 0.725 | 101.184 |
| 0.7256944444444445 | 101.184 |
| 0.7263888888888889 | 101.184 |
| 0.7270833333333333 | 101.184 |
| 0.7277777777777777 | 101.184 |
| 0.7284722222222223 | 101.184 |
| 0.7291666666666666 | 101.184 |
| 0.7298611111111111 | 101.184 |
| 0.7305555555555556 | 101.184 |
| 0.7312500000000001 | 101.184 |
| 0.7319444444444444 | 96.682 |
| 0.7326388888888888 | 92.184 |
| 0.7333333333333334 | 96.682 |
| 0.7340277777777778 | 96.682 |
| 0.7347222222222222 | 96.682 |
| 0.7354166666666666 | 96.682 |
| 0.7361111111111112 | 101.184 |
| 0.7368055555555556 | 96.682 |
| 0.7374999999999999 | 96.682 |
| 0.7381944444444444 | 96.682 |
| 0.7388888888888889 | 96.682 |
| 0.7395833333333334 | 101.184 |
| 0.7402777777777777 | 101.184 |
| 0.7409722222222223 | 101.184 |
| 0.7416666666666667 | 101.184 |
| 0.7423611111111111 | 101.184 |
| 0.7430555555555555 | 101.184 |
| 0.74375 | 101.184 |
| 0.7444444444444445 | 101.184 |
| 0.7451388888888889 | 96.682 |
| 0.7458333333333332 | 96.682 |
| 0.7465277777777778 | 96.682 |
| 0.7472222222222222 | 92.184 |
| 0.7479166666666667 | 92.184 |
| 0.748611111111111 | 92.184 |
| 0.7493055555555556 | 92.184 |
| 0.75 | 92.184 |
| 0.7506944444444444 | 87.692 |
| 0.751388888888889 | 87.692 |
| 0.7520833333333333 | 87.692 |
| 0.7527777777777778 | 83.205 |
| 0.7534722222222222 | 87.692 |
| 0.7541666666666668 | 83.205 |
| 0.7548611111111111 | 83.205 |
| 0.7555555555555555 | 83.205 |
| 0.75625 | 83.205 |
| 0.7569444444444445 | 83.205 |
| 0.7576388888888889 | 83.205 |
| 0.7583333333333333 | 83.205 |
| 0.7590277777777777 | 78.722 |
| 0.7597222222222223 | 78.722 |
| 0.7604166666666666 | 78.722 |
| 0.7611111111111111 | 78.722 |
| 0.7618055555555556 | 78.722 |
| 0.7625000000000001 | 78.722 |
| 0.7631944444444444 | 74.246 |
| 0.7638888888888888 | 74.246 |
| 0.7645833333333334 | 74.246 |
| 0.7652777777777778 | 74.246 |
| 0.7659722222222222 | 69.775 |
| 0.7666666666666666 | 69.775 |
| 0.7673611111111112 | 69.775 |
| 0.7680555555555556 | 69.775 |
| 0.7687499999999999 | 69.775 |
| 0.7694444444444444 | 65.31 |
| 0.7701388888888889 | 65.31 |
| 0.7708333333333334 | 65.31 |
| 0.7715277777777777 | 65.31 |
| 0.7722222222222223 | 65.31 |
| 0.7729166666666667 | 60.85 |
| 0.7736111111111111 | 60.85 |
| 0.7743055555555555 | 60.85 |
| 0.775 | 56.398 |
| 0.7756944444444445 | 56.398 |
| 0.7763888888888889 | 56.398 |
| 0.7770833333333332 | 56.398 |
| 0.7777777777777778 | 56.398 |
| 0.7784722222222222 | 56.398 |
| 0.7791666666666667 | 56.398 |
| 0.779861111111111 | 56.398 |
| 0.7805555555555556 | 56.398 |
| 0.78125 | 51.951 |
| 0.7819444444444444 | 51.951 |
| 0.782638888888889 | 51.951 |
| 0.7833333333333333 | 51.951 |
| 0.7840277777777778 | 51.951 |
| 0.7847222222222222 | 51.951 |
| 0.7854166666666668 | 51.951 |
| 0.7861111111111111 | 51.951 |
| 0.7868055555555555 | 51.951 |
| 0.7875 | 51.951 |
| 0.7881944444444445 | 51.951 |
| 0.7888888888888889 | 47.511 |
| 0.7895833333333333 | 47.511 |
| 0.7902777777777777 | 47.511 |
| 0.7909722222222223 | 47.511 |
| 0.7916666666666666 | 47.511 |
| 0.7923611111111111 | 47.511 |
| 0.7930555555555556 | 43.079 |
| 0.7937500000000001 | 43.079 |
| 0.7944444444444444 | 43.079 |
| 0.7951388888888888 | 43.079 |
| 0.7958333333333334 | 43.079 |
| 0.7965277777777778 | 38.653 |
| 0.7972222222222222 | 38.653 |
| 0.7979166666666666 | 38.653 |
| 0.7986111111111112 | 38.653 |
| 0.7993055555555556 | 38.653 |
| 0.7999999999999999 | 38.653 |
| 0.8006944444444444 | 38.653 |
| 0.8013888888888889 | 38.653 |
| 0.8020833333333334 | 38.653 |
| 0.8027777777777777 | 38.653 |
| 0.8034722222222223 | 38.653 |
| 0.8041666666666667 | 38.653 |
| 0.8048611111111111 | 38.653 |
| 0.8055555555555555 | 38.653 |
| 0.80625 | 38.653 |
| 0.8069444444444445 | 34.234 |
| 0.8076388888888889 | 34.234 |
| 0.8083333333333332 | 34.234 |
| 0.8090277777777778 | 34.234 |
| 0.8097222222222222 | 29.823 |
| 0.8104166666666667 | 29.823 |
| 0.811111111111111 | 29.823 |
| 0.8118055555555556 | 29.823 |
| 0.8125 | 29.823 |
| 0.8131944444444444 | 25.419 |
| 0.813888888888889 | 25.419 |
| 0.8145833333333333 | 25.419 |
| 0.8152777777777778 | 25.419 |
| 0.8159722222222222 | 21.024 |
| 0.8166666666666668 | 21.024 |
| 0.8173611111111111 | 21.024 |
| 0.8180555555555555 | 16.636 |
| 0.81875 | 12.257 |
| 0.8194444444444445 | 12.257 |
| 0.8201388888888889 | 12.257 |
| 0.8208333333333333 | 7.887 |
| 0.8215277777777777 | 7.887 |
| 0.8222222222222223 | 7.887 |
| 0.8229166666666666 | 7.887 |
| 0.8236111111111111 | 7.887 |
| 0.8243055555555556 | 3.525 |
| 0.8250000000000001 | 3.525 |
| 0.8256944444444444 | 3.525 |
| 0.8263888888888888 | 3.525 |
| 0.8270833333333334 | 3.525 |
| 0.8277777777777778 | 3.525 |
| 0.8284722222222222 | 3.525 |
| 0.8291666666666666 | 3.525 |
| 0.8298611111111112 | 0 |
| 0.8305555555555556 | 0 |
| 0.8312499999999999 | 0 |
| 0.8319444444444444 | 0 |
| 0.8326388888888889 | 0 |
| 0.8333333333333334 | 0 |
| 0.8340277777777777 | 0 |
| 0.8347222222222223 | 0 |
| 0.8354166666666667 | 0 |
| 0.8361111111111111 | 0 |
| 0.8368055555555555 | 0 |
| 0.8375 | 0 |
| 0.8381944444444445 | 0 |
| 0.8388888888888889 | 0 |
| 0.8395833333333332 | 0 |
| 0.8402777777777778 | 0 |
| 0.8409722222222222 | 0 |
| 0.8416666666666667 | 0 |
| 0.842361111111111 | 0 |
| 0.8430555555555556 | 0 |
| 0.84375 | 0 |
| 0.8444444444444444 | 0 |
| 0.845138888888889 | 0 |
| 0.8458333333333333 | 0 |
| 0.8465277777777778 | 0 |
| 0.8472222222222222 | 0 |
| 0.8479166666666668 | 0 |
| 0.8486111111111111 | 0 |
| 0.8493055555555555 | 0 |
| 0.85 | 0 |
| 0.8506944444444445 | 0 |
| 0.8513888888888889 | 0 |
| 0.8520833333333333 | 0 |
| 0.8527777777777777 | 0 |
| 0.8534722222222223 | 0 |
| 0.8541666666666666 | 0 |
| 0.8548611111111111 | 0 |
| 0.8555555555555556 | 0 |
| 0.8562500000000001 | 0 |
| 0.8569444444444444 | 0 |
| 0.8576388888888888 | 0 |
| 0.8583333333333334 | 0 |
| 0.8590277777777778 | 0 |
| 0.8597222222222222 | 0 |
| 0.8604166666666666 | 0 |
| 0.8611111111111112 | 0 |
| 0.8618055555555556 | 0 |
| 0.8624999999999999 | 0 |
| 0.8631944444444444 | 0 |
| 0.8638888888888889 | 0 |
| 0.8645833333333334 | 0 |
| 0.8652777777777777 | 0 |
| 0.8659722222222223 | 0 |
| 0.8666666666666667 | 0 |
| 0.8673611111111111 | 0 |
| 0.8680555555555555 | 0 |
| 0.86875 | 0 |
| 0.8694444444444445 | 0 |
| 0.8701388888888889 | 0 |
| 0.8708333333333332 | 0 |
| 0.8715277777777778 | 0 |
| 0.8722222222222222 | 0 |
| 0.8729166666666667 | 0 |
| 0.873611111111111 | 0 |
| 0.8743055555555556 | 0 |
| 0.875 | 0 |
| 0.8756944444444444 | 0 |
| 0.876388888888889 | 0 |
| 0.8770833333333333 | 0 |
| 0.8777777777777778 | 0 |
| 0.8784722222222222 | 0 |
| 0.8791666666666668 | 0 |
| 0.8798611111111111 | 0 |
| 0.8805555555555555 | 0 |
| 0.88125 | 0 |
| 0.8819444444444445 | 0 |
| 0.8826388888888889 | 0 |
| 0.8833333333333333 | 0 |
| 0.8840277777777777 | 0 |
| 0.8847222222222223 | 0 |
| 0.8854166666666666 | 0 |
| 0.8861111111111111 | 0 |
| 0.8868055555555556 | 0 |
| 0.8875000000000001 | 0 |
| 0.8881944444444444 | 0 |
| 0.8888888888888888 | 0 |
| 0.8895833333333334 | 0 |
| 0.8902777777777778 | 0 |
| 0.8909722222222222 | 0 |
| 0.8916666666666666 | 0 |
| 0.8923611111111112 | 0 |
| 0.8930555555555556 | 0 |
| 0.8937499999999999 | 0 |
| 0.8944444444444444 | 0 |
| 0.8951388888888889 | 0 |
| 0.8958333333333334 | 0 |
| 0.8965277777777777 | 0 |
| 0.8972222222222223 | 0 |
| 0.8979166666666667 | 0 |
| 0.8986111111111111 | 0 |
| 0.8993055555555555 | 0 |
| 0.9 | 0 |
| 0.9006944444444445 | 0 |
| 0.9013888888888889 | 0 |
| 0.9020833333333332 | 0 |
| 0.9027777777777778 | 0 |
| 0.9034722222222222 | 0 |
| 0.9041666666666667 | 0 |
| 0.904861111111111 | 0 |
| 0.9055555555555556 | 0 |
| 0.90625 | 0 |
| 0.9069444444444444 | 0 |
| 0.907638888888889 | 0 |
| 0.9083333333333333 | 0 |
| 0.9090277777777778 | 0 |
| 0.9097222222222222 | 0 |
| 0.9104166666666668 | 0 |
| 0.9111111111111111 | 0 |
| 0.9118055555555555 | 0 |
| 0.9125 | 0 |
| 0.9131944444444445 | 0 |
| 0.9138888888888889 | 0 |
| 0.9145833333333333 | 0 |
| 0.9152777777777777 | 0 |
| 0.9159722222222223 | 0 |
| 0.9166666666666666 | 0 |
| 0.9173611111111111 | 0 |
| 0.9180555555555556 | 0 |
| 0.9187500000000001 | 0 |
| 0.9194444444444444 | 0 |
| 0.9201388888888888 | 0 |
| 0.9208333333333334 | 0 |
| 0.9215277777777778 | 0 |
| 0.9222222222222222 | 0 |
| 0.9229166666666666 | 0 |
| 0.9236111111111112 | 0 |
| 0.9243055555555556 | 0 |
| 0.9249999999999999 | 0 |
| 0.9256944444444444 | 0 |
| 0.9263888888888889 | 0 |
| 0.9270833333333334 | 0 |
| 0.9277777777777777 | 0 |
| 0.9284722222222223 | 0 |
| 0.9291666666666667 | 0 |
| 0.9298611111111111 | 0 |
| 0.9305555555555555 | 0 |
| 0.93125 | 0 |
| 0.9319444444444445 | 0 |
| 0.9326388888888889 | 0 |
| 0.9333333333333332 | 0 |
| 0.9340277777777778 | 0 |
| 0.9347222222222222 | 0 |
| 0.9354166666666667 | 0 |
| 0.936111111111111 | 0 |
| 0.9368055555555556 | 0 |
| 0.9375 | 0 |
| 0.9381944444444444 | 0 |
| 0.938888888888889 | 0 |
| 0.9395833333333333 | 0 |
| 0.9402777777777778 | 0 |
| 0.9409722222222222 | 0 |
| 0.9416666666666668 | 0 |
| 0.9423611111111111 | 0 |
| 0.9430555555555555 | 0 |
| 0.94375 | 0 |
| 0.9444444444444445 | 0 |
| 0.9451388888888889 | 0 |
| 0.9458333333333333 | 0 |
| 0.9465277777777777 | 0 |
| 0.9472222222222223 | 0 |
| 0.9479166666666666 | 0 |
| 0.9486111111111111 | 0 |
| 0.9493055555555556 | 0 |
| 0.9500000000000001 | 0 |
| 0.9506944444444444 | 0 |
| 0.9513888888888888 | 0 |
| 0.9520833333333334 | 0 |
| 0.9527777777777778 | 0 |
| 0.9534722222222222 | 0 |
| 0.9541666666666666 | 0 |
| 0.9548611111111112 | 0 |
| 0.9555555555555556 | 0 |
| 0.9562499999999999 | 0 |
| 0.9569444444444444 | 0 |
| 0.9576388888888889 | 0 |
| 0.9583333333333334 | 0 |
| 0.9590277777777777 | 0 |
| 0.9597222222222223 | 0 |
| 0.9604166666666667 | 0 |
| 0.9611111111111111 | 0 |
| 0.9618055555555555 | 0 |
| 0.9625 | 0 |
| 0.9631944444444445 | 0 |
| 0.9638888888888889 | 0 |
| 0.9645833333333332 | 0 |
| 0.9652777777777778 | 0 |
| 0.9659722222222222 | 0 |
| 0.9666666666666667 | 0 |
| 0.967361111111111 | 0 |
| 0.9680555555555556 | 0 |
| 0.96875 | 0 |
| 0.9694444444444444 | 0 |
| 0.970138888888889 | 0 |
| 0.9708333333333333 | 0 |
| 0.9715277777777778 | 0 |
| 0.9722222222222222 | 0 |
| 0.9729166666666668 | 0 |
| 0.9736111111111111 | 0 |
| 0.9743055555555555 | 0 |
| 0.975 | 0 |
| 0.9756944444444445 | 0 |
| 0.9763888888888889 | 0 |
| 0.9770833333333333 | 0 |
| 0.9777777777777777 | 0 |
| 0.9784722222222223 | 0 |
| 0.9791666666666666 | 0 |
| 0.9798611111111111 | 0 |
| 0.9805555555555556 | 0 |
| 0.9812500000000001 | 0 |
| 0.9819444444444444 | 0 |
| 0.9826388888888888 | 0 |
| 0.9833333333333334 | 0 |
| 0.9840277777777778 | 0 |
| 0.9847222222222222 | 0 |
| 0.9854166666666666 | 0 |
| 0.9861111111111112 | 0 |
| 0.9868055555555556 | 0 |
| 0.9874999999999999 | 0 |
| 0.9881944444444444 | 0 |
| 0.9888888888888889 | 0 |
| 0.9895833333333334 | 0 |
| 0.9902777777777777 | 0 |
| 0.9909722222222223 | 0 |
| 0.9916666666666667 | 0 |
| 0.9923611111111111 | 0 |
| 0.9930555555555555 | 0 |
| 0.99375 | 0 |
| 0.9944444444444445 | 0 |
| 0.9951388888888889 | 0 |
| 0.9958333333333332 | 0 |
| 0.9965277777777778 | 0 |
| 0.9972222222222222 | 0 |
| 0.9979166666666667 | 0 |
| 0.998611111111111 | 0 |
| 0.9993055555555556 | 0 |